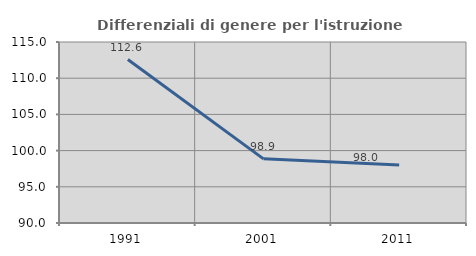
| Category | Differenziali di genere per l'istruzione superiore |
|---|---|
| 1991.0 | 112.581 |
| 2001.0 | 98.861 |
| 2011.0 | 98.017 |